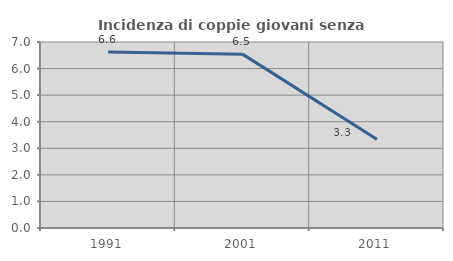
| Category | Incidenza di coppie giovani senza figli |
|---|---|
| 1991.0 | 6.622 |
| 2001.0 | 6.543 |
| 2011.0 | 3.343 |